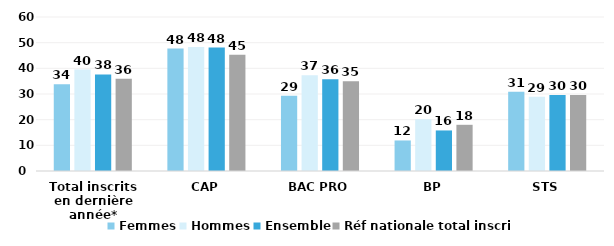
| Category | Femmes | Hommes | Ensemble | Réf nationale total inscrits |
|---|---|---|---|---|
| Total inscrits en dernière année* | 33.8 | 39.5 | 37.6 | 35.9 |
| CAP | 47.7 | 48.3 | 48.1 | 45.3 |
| BAC PRO | 29.3 | 37.3 | 35.7 | 35 |
| BP | 11.9 | 20.2 | 15.8 | 18 |
| STS | 30.9 | 28.9 | 29.6 | 29.6 |